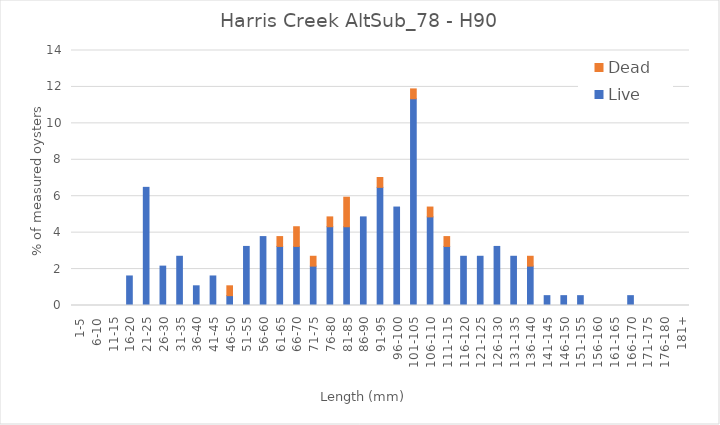
| Category | Live | Dead |
|---|---|---|
| 1-5 | 0 | 0 |
| 6-10 | 0 | 0 |
| 11-15 | 0 | 0 |
| 16-20 | 1.622 | 0 |
| 21-25 | 6.486 | 0 |
| 26-30 | 2.162 | 0 |
| 31-35 | 2.703 | 0 |
| 36-40 | 1.081 | 0 |
| 41-45 | 1.622 | 0 |
| 46-50 | 0.541 | 0.541 |
| 51-55 | 3.243 | 0 |
| 56-60 | 3.784 | 0 |
| 61-65 | 3.243 | 0.541 |
| 66-70 | 3.243 | 1.081 |
| 71-75 | 2.162 | 0.541 |
| 76-80 | 4.324 | 0.541 |
| 81-85 | 4.324 | 1.622 |
| 86-90 | 4.865 | 0 |
| 91-95 | 6.486 | 0.541 |
| 96-100 | 5.405 | 0 |
| 101-105 | 11.351 | 0.541 |
| 106-110 | 4.865 | 0.541 |
| 111-115 | 3.243 | 0.541 |
| 116-120 | 2.703 | 0 |
| 121-125 | 2.703 | 0 |
| 126-130 | 3.243 | 0 |
| 131-135 | 2.703 | 0 |
| 136-140 | 2.162 | 0.541 |
| 141-145 | 0.541 | 0 |
| 146-150 | 0.541 | 0 |
| 151-155 | 0.541 | 0 |
| 156-160 | 0 | 0 |
| 161-165 | 0 | 0 |
| 166-170 | 0.541 | 0 |
| 171-175 | 0 | 0 |
| 176-180 | 0 | 0 |
| 181+ | 0 | 0 |